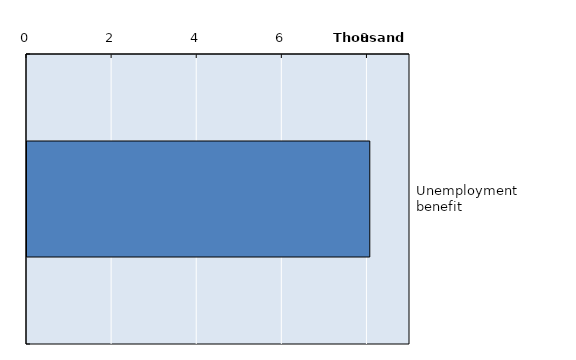
| Category | Series 0 |
|---|---|
| Unemployment benefit | 8055 |